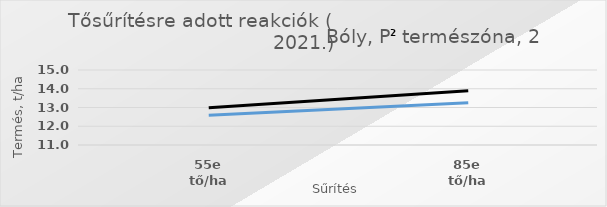
| Category | Series 0 | 2. Hibrid |
|---|---|---|
| 55e tő/ha | 12.591 | 12.986 |
| 85e tő/ha | 13.253 | 13.887 |